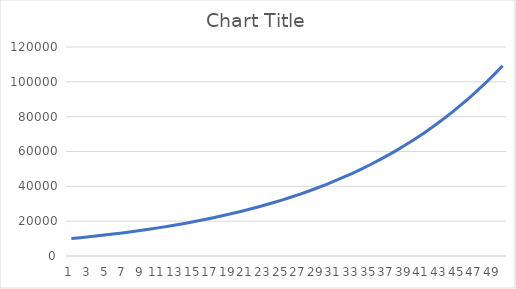
| Category | Series 0 |
|---|---|
| 0 | 10000 |
| 1 | 10500 |
| 2 | 11025 |
| 3 | 11576.25 |
| 4 | 12155.062 |
| 5 | 12762.816 |
| 6 | 13400.956 |
| 7 | 14071.004 |
| 8 | 14774.554 |
| 9 | 15513.282 |
| 10 | 16288.946 |
| 11 | 17103.394 |
| 12 | 17958.563 |
| 13 | 18856.491 |
| 14 | 19799.316 |
| 15 | 20789.282 |
| 16 | 21828.746 |
| 17 | 22920.183 |
| 18 | 24066.192 |
| 19 | 25269.502 |
| 20 | 26532.977 |
| 21 | 27859.626 |
| 22 | 29252.607 |
| 23 | 30715.238 |
| 24 | 32250.999 |
| 25 | 33863.549 |
| 26 | 35556.727 |
| 27 | 37334.563 |
| 28 | 39201.291 |
| 29 | 41161.356 |
| 30 | 43219.424 |
| 31 | 45380.395 |
| 32 | 47649.415 |
| 33 | 50031.885 |
| 34 | 52533.48 |
| 35 | 55160.154 |
| 36 | 57918.161 |
| 37 | 60814.069 |
| 38 | 63854.773 |
| 39 | 67047.512 |
| 40 | 70399.887 |
| 41 | 73919.881 |
| 42 | 77615.876 |
| 43 | 81496.669 |
| 44 | 85571.503 |
| 45 | 89850.078 |
| 46 | 94342.582 |
| 47 | 99059.711 |
| 48 | 104012.696 |
| 49 | 109213.331 |